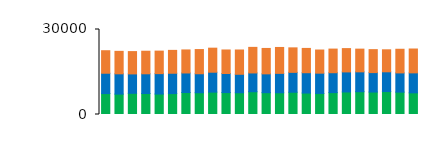
| Category | South |
|---|---|
| 0 | 7949 |
| 1 | 7927 |
| 2 | 7875 |
| 3 | 7963 |
| 4 | 7947 |
| 5 | 8073 |
| 6 | 8132 |
| 7 | 8541 |
| 8 | 8487 |
| 9 | 8302 |
| 10 | 8569 |
| 11 | 9027 |
| 12 | 8967 |
| 13 | 9141 |
| 14 | 8648 |
| 15 | 8575 |
| 16 | 8168 |
| 17 | 8342 |
| 18 | 8228 |
| 19 | 8014 |
| 20 | 8104 |
| 21 | 7765 |
| 22 | 8345 |
| 23 | 8420 |